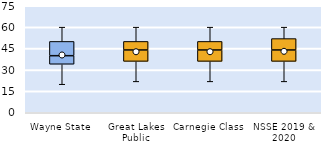
| Category | 25th | 50th | 75th |
|---|---|---|---|
| Wayne State | 34 | 6 | 10 |
| Great Lakes Public | 36 | 8 | 6 |
| Carnegie Class | 36 | 8 | 6 |
| NSSE 2019 & 2020 | 36 | 8 | 8 |